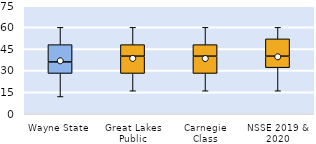
| Category | 25th | 50th | 75th |
|---|---|---|---|
| Wayne State | 28 | 8 | 12 |
| Great Lakes Public | 28 | 12 | 8 |
| Carnegie Class | 28 | 12 | 8 |
| NSSE 2019 & 2020 | 32 | 8 | 12 |